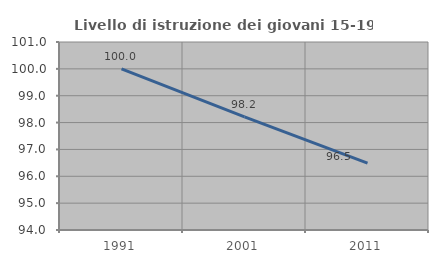
| Category | Livello di istruzione dei giovani 15-19 anni |
|---|---|
| 1991.0 | 100 |
| 2001.0 | 98.214 |
| 2011.0 | 96.491 |